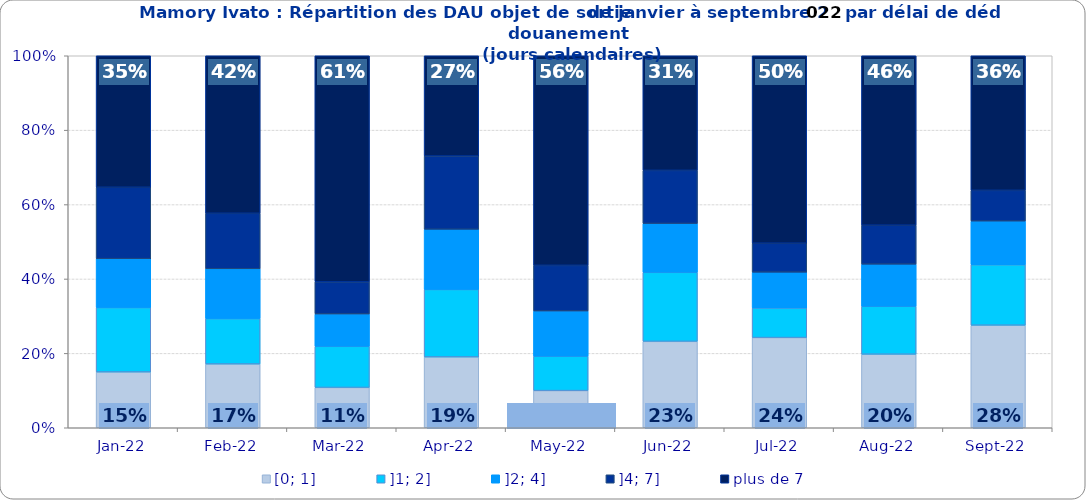
| Category | [0; 1] | ]1; 2] | ]2; 4] | ]4; 7] | plus de 7 |
|---|---|---|---|---|---|
| 2022-01-01 | 0.15 | 0.173 | 0.131 | 0.192 | 0.354 |
| 2022-02-01 | 0.171 | 0.122 | 0.134 | 0.149 | 0.423 |
| 2022-03-01 | 0.108 | 0.111 | 0.087 | 0.086 | 0.608 |
| 2022-04-01 | 0.19 | 0.182 | 0.162 | 0.197 | 0.27 |
| 2022-05-01 | 0.1 | 0.093 | 0.121 | 0.123 | 0.563 |
| 2022-06-01 | 0.232 | 0.186 | 0.131 | 0.143 | 0.308 |
| 2022-07-01 | 0.242 | 0.08 | 0.096 | 0.078 | 0.504 |
| 2022-08-01 | 0.198 | 0.129 | 0.113 | 0.105 | 0.455 |
| 2022-09-01 | 0.276 | 0.163 | 0.117 | 0.083 | 0.362 |